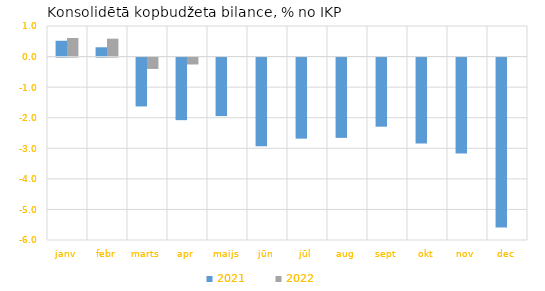
| Category | 2021 | 2022 |
|---|---|---|
| janv | 0.517 | 0.608 |
| febr | 0.304 | 0.586 |
| marts | -1.599 | -0.372 |
| apr | -2.048 | -0.226 |
| maijs | -1.915 | 0 |
| jūn | -2.897 | 0 |
| jūl | -2.652 | 0 |
| aug | -2.627 | 0 |
| sept | -2.261 | 0 |
| okt | -2.809 | 0 |
| nov | -3.135 | 0 |
| dec | -5.554 | 0 |